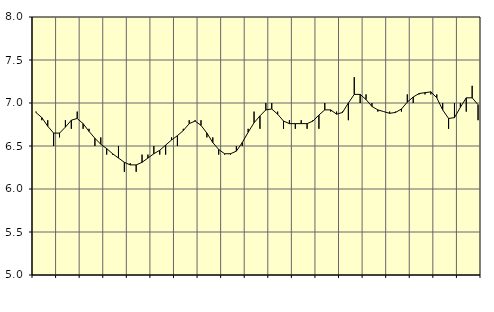
| Category | Piggar | Transport, SNI 49-53 |
|---|---|---|
| nan | 6.9 | 6.89 |
| 1.0 | 6.8 | 6.83 |
| 1.0 | 6.8 | 6.73 |
| 1.0 | 6.5 | 6.65 |
| nan | 6.6 | 6.65 |
| 2.0 | 6.8 | 6.72 |
| 2.0 | 6.7 | 6.8 |
| 2.0 | 6.9 | 6.82 |
| nan | 6.7 | 6.76 |
| 3.0 | 6.7 | 6.67 |
| 3.0 | 6.5 | 6.59 |
| 3.0 | 6.6 | 6.52 |
| nan | 6.4 | 6.47 |
| 4.0 | 6.4 | 6.41 |
| 4.0 | 6.5 | 6.36 |
| 4.0 | 6.2 | 6.31 |
| nan | 6.3 | 6.28 |
| 5.0 | 6.2 | 6.28 |
| 5.0 | 6.4 | 6.31 |
| 5.0 | 6.4 | 6.36 |
| nan | 6.5 | 6.41 |
| 6.0 | 6.4 | 6.45 |
| 6.0 | 6.4 | 6.51 |
| 6.0 | 6.6 | 6.57 |
| nan | 6.5 | 6.62 |
| 7.0 | 6.7 | 6.68 |
| 7.0 | 6.8 | 6.76 |
| 7.0 | 6.8 | 6.79 |
| nan | 6.8 | 6.74 |
| 8.0 | 6.6 | 6.65 |
| 8.0 | 6.6 | 6.54 |
| 8.0 | 6.4 | 6.46 |
| nan | 6.4 | 6.41 |
| 9.0 | 6.4 | 6.41 |
| 9.0 | 6.5 | 6.44 |
| 9.0 | 6.5 | 6.54 |
| nan | 6.7 | 6.66 |
| 10.0 | 6.9 | 6.77 |
| 10.0 | 6.7 | 6.85 |
| 10.0 | 7 | 6.92 |
| nan | 7 | 6.93 |
| 11.0 | 6.9 | 6.87 |
| 11.0 | 6.7 | 6.79 |
| 11.0 | 6.8 | 6.76 |
| nan | 6.7 | 6.76 |
| 12.0 | 6.8 | 6.76 |
| 12.0 | 6.7 | 6.76 |
| 12.0 | 6.8 | 6.79 |
| nan | 6.7 | 6.86 |
| 13.0 | 7 | 6.92 |
| 13.0 | 6.9 | 6.92 |
| 13.0 | 6.9 | 6.87 |
| nan | 6.9 | 6.89 |
| 14.0 | 6.8 | 7 |
| 14.0 | 7.3 | 7.1 |
| 14.0 | 7 | 7.1 |
| nan | 7.1 | 7.04 |
| 15.0 | 7 | 6.96 |
| 15.0 | 6.9 | 6.92 |
| 15.0 | 6.9 | 6.9 |
| nan | 6.9 | 6.88 |
| 16.0 | 6.9 | 6.89 |
| 16.0 | 6.9 | 6.93 |
| 16.0 | 7.1 | 7.01 |
| nan | 7 | 7.07 |
| 17.0 | 7.1 | 7.11 |
| 17.0 | 7.1 | 7.12 |
| 17.0 | 7.1 | 7.13 |
| nan | 7.1 | 7.06 |
| 18.0 | 7 | 6.92 |
| 18.0 | 6.7 | 6.82 |
| 18.0 | 7 | 6.83 |
| nan | 7 | 6.95 |
| 19.0 | 6.9 | 7.06 |
| 19.0 | 7.2 | 7.06 |
| 19.0 | 6.8 | 6.98 |